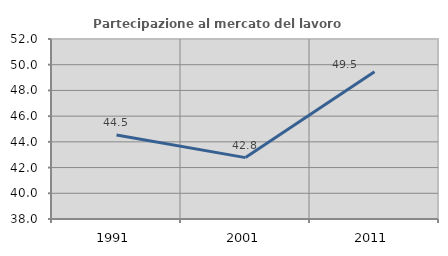
| Category | Partecipazione al mercato del lavoro  femminile |
|---|---|
| 1991.0 | 44.53 |
| 2001.0 | 42.774 |
| 2011.0 | 49.459 |